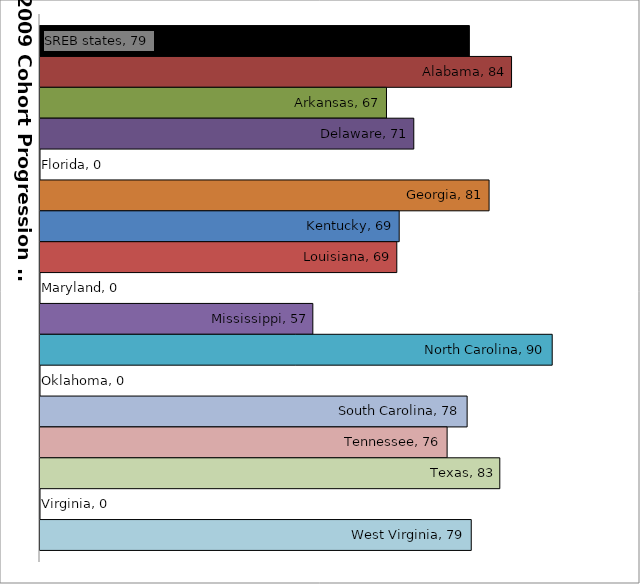
| Category | SREB states | Alabama | Arkansas | Delaware | Florida | Georgia | Kentucky | Louisiana | Maryland | Mississippi | North Carolina | Oklahoma | South Carolina | Tennessee | Texas | Virginia | West Virginia |
|---|---|---|---|---|---|---|---|---|---|---|---|---|---|---|---|---|---|
| 0 | 78.716 | 84.486 | 67.381 | 71.116 | 0 | 81.414 | 69.122 | 68.794 | 0 | 57.31 | 90.047 | 0 | 78.411 | 75.674 | 82.88 | 0 | 78.975 |